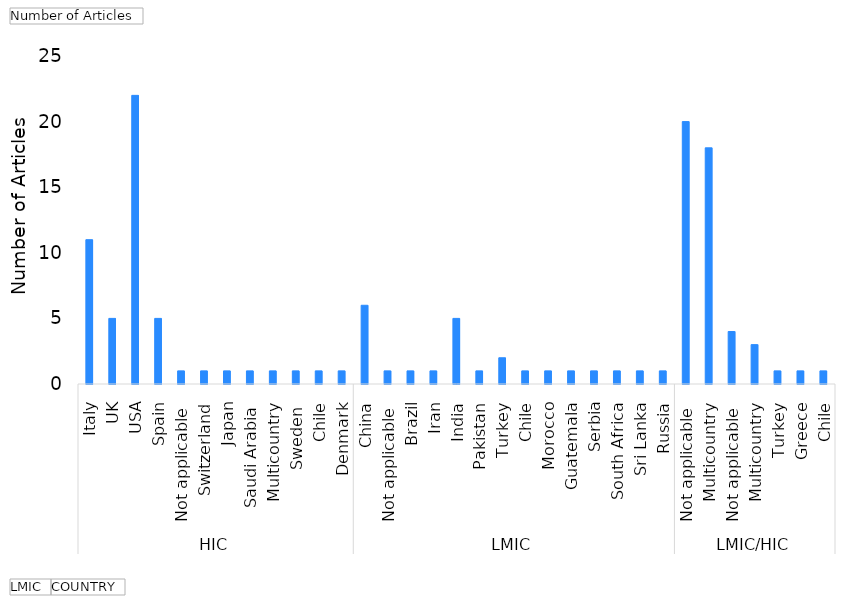
| Category | Total |
|---|---|
| 0 | 11 |
| 1 | 5 |
| 2 | 22 |
| 3 | 5 |
| 4 | 1 |
| 5 | 1 |
| 6 | 1 |
| 7 | 1 |
| 8 | 1 |
| 9 | 1 |
| 10 | 1 |
| 11 | 1 |
| 12 | 6 |
| 13 | 1 |
| 14 | 1 |
| 15 | 1 |
| 16 | 5 |
| 17 | 1 |
| 18 | 2 |
| 19 | 1 |
| 20 | 1 |
| 21 | 1 |
| 22 | 1 |
| 23 | 1 |
| 24 | 1 |
| 25 | 1 |
| 26 | 20 |
| 27 | 18 |
| 28 | 4 |
| 29 | 3 |
| 30 | 1 |
| 31 | 1 |
| 32 | 1 |